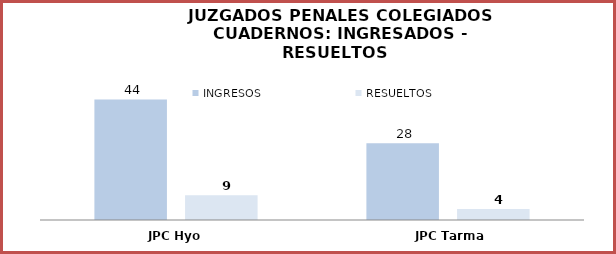
| Category | INGRESOS | RESUELTOS |
|---|---|---|
| JPC Hyo | 44 | 9 |
| JPC Tarma | 28 | 4 |